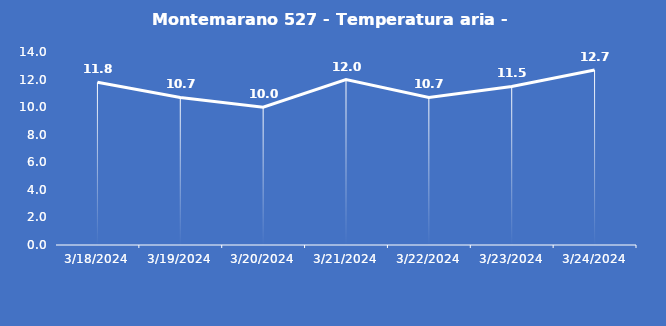
| Category | Montemarano 527 - Temperatura aria - Grezzo (°C) |
|---|---|
| 3/18/24 | 11.8 |
| 3/19/24 | 10.7 |
| 3/20/24 | 10 |
| 3/21/24 | 12 |
| 3/22/24 | 10.7 |
| 3/23/24 | 11.5 |
| 3/24/24 | 12.7 |